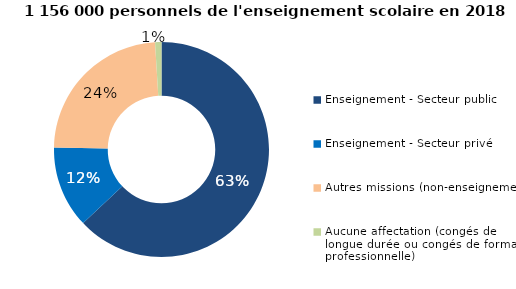
| Category | Effectifs 2018-2019 |
|---|---|
| Enseignement - Secteur public | 0.63 |
| Enseignement - Secteur privé | 0.123 |
| Autres missions (non-enseignement) | 0.237 |
| Aucune affectation (congés de longue durée ou congés de formation professionnelle) | 0.01 |